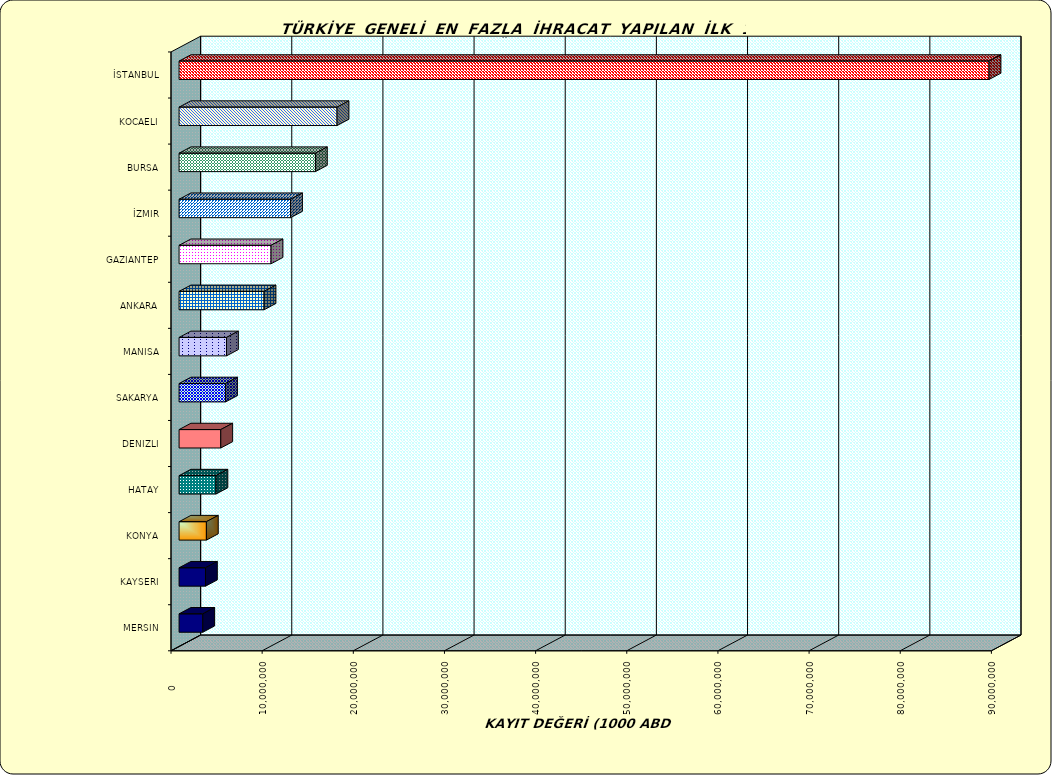
| Category | Series 0 |
|---|---|
| İSTANBUL | 88860053.202 |
| KOCAELI | 17331600.628 |
| BURSA | 14959238.458 |
| İZMIR | 12230575.019 |
| GAZIANTEP | 10092165.375 |
| ANKARA | 9321527.946 |
| MANISA | 5205188.314 |
| SAKARYA | 5099790.15 |
| DENIZLI | 4574358.28 |
| HATAY | 4046191.65 |
| KONYA | 2997558.209 |
| KAYSERI | 2897741.775 |
| MERSIN | 2601046.146 |